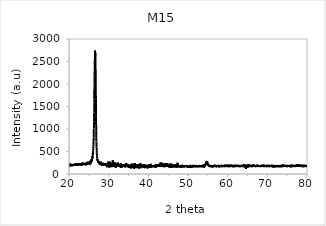
| Category | M15 |
|---|---|
| 20.0 | 202 |
| 20.02 | 184 |
| 20.04 | 186 |
| 20.06 | 164 |
| 20.08 | 152 |
| 20.1 | 196 |
| 20.12 | 188 |
| 20.14 | 162 |
| 20.16 | 178 |
| 20.18 | 228 |
| 20.2 | 204 |
| 20.22 | 192 |
| 20.24 | 180 |
| 20.26 | 234 |
| 20.28 | 190 |
| 20.3 | 220 |
| 20.32 | 182 |
| 20.34 | 214 |
| 20.36 | 182 |
| 20.38 | 204 |
| 20.4 | 214 |
| 20.42 | 176 |
| 20.44 | 214 |
| 20.46 | 188 |
| 20.48 | 200 |
| 20.5 | 204 |
| 20.52 | 204 |
| 20.54 | 216 |
| 20.56 | 192 |
| 20.58 | 194 |
| 20.6 | 198 |
| 20.62 | 216 |
| 20.64 | 204 |
| 20.66 | 198 |
| 20.68 | 170 |
| 20.7 | 186 |
| 20.72 | 194 |
| 20.74 | 202 |
| 20.76 | 208 |
| 20.78 | 198 |
| 20.8 | 204 |
| 20.82 | 196 |
| 20.84 | 196 |
| 20.86 | 200 |
| 20.88 | 194 |
| 20.9 | 178 |
| 20.92 | 214 |
| 20.94 | 188 |
| 20.96 | 220 |
| 20.98 | 196 |
| 21.0 | 202 |
| 21.02 | 190 |
| 21.04 | 212 |
| 21.06 | 184 |
| 21.08 | 188 |
| 21.1 | 178 |
| 21.12 | 208 |
| 21.14 | 198 |
| 21.16 | 216 |
| 21.18 | 196 |
| 21.2 | 192 |
| 21.22 | 180 |
| 21.24 | 200 |
| 21.26 | 210 |
| 21.28 | 204 |
| 21.3 | 218 |
| 21.32 | 200 |
| 21.34 | 210 |
| 21.36 | 208 |
| 21.38 | 218 |
| 21.4 | 176 |
| 21.42 | 214 |
| 21.44 | 206 |
| 21.46 | 176 |
| 21.48 | 216 |
| 21.5 | 230 |
| 21.52 | 182 |
| 21.54 | 214 |
| 21.56 | 196 |
| 21.58 | 180 |
| 21.6 | 204 |
| 21.62 | 190 |
| 21.64 | 194 |
| 21.66 | 230 |
| 21.68 | 204 |
| 21.7 | 202 |
| 21.72 | 212 |
| 21.74 | 242 |
| 21.76 | 224 |
| 21.78 | 206 |
| 21.8 | 202 |
| 21.82 | 218 |
| 21.84 | 210 |
| 21.86 | 230 |
| 21.88 | 182 |
| 21.9 | 232 |
| 21.92 | 226 |
| 21.94 | 208 |
| 21.96 | 240 |
| 21.98 | 196 |
| 22.0 | 190 |
| 22.02 | 200 |
| 22.04 | 210 |
| 22.06 | 208 |
| 22.08 | 216 |
| 22.1 | 234 |
| 22.12 | 224 |
| 22.14 | 220 |
| 22.16 | 206 |
| 22.18 | 224 |
| 22.2 | 210 |
| 22.22 | 220 |
| 22.24 | 218 |
| 22.26 | 212 |
| 22.28 | 224 |
| 22.3 | 230 |
| 22.32 | 184 |
| 22.34 | 220 |
| 22.36 | 220 |
| 22.38 | 236 |
| 22.4 | 222 |
| 22.42 | 202 |
| 22.44 | 206 |
| 22.46 | 200 |
| 22.48 | 218 |
| 22.5 | 208 |
| 22.52 | 212 |
| 22.54 | 208 |
| 22.56 | 206 |
| 22.58 | 208 |
| 22.6 | 210 |
| 22.62 | 214 |
| 22.64 | 214 |
| 22.66 | 228 |
| 22.68 | 218 |
| 22.7 | 210 |
| 22.72 | 234 |
| 22.74 | 206 |
| 22.76 | 210 |
| 22.78 | 216 |
| 22.8 | 216 |
| 22.82 | 204 |
| 22.84 | 226 |
| 22.86 | 228 |
| 22.88 | 202 |
| 22.9 | 212 |
| 22.92 | 208 |
| 22.94 | 190 |
| 22.96 | 202 |
| 22.98 | 230 |
| 23.0 | 226 |
| 23.02 | 212 |
| 23.04 | 218 |
| 23.06 | 224 |
| 23.08 | 228 |
| 23.1 | 216 |
| 23.12 | 208 |
| 23.14 | 212 |
| 23.16 | 222 |
| 23.18 | 206 |
| 23.2 | 240 |
| 23.22 | 224 |
| 23.24 | 228 |
| 23.26 | 224 |
| 23.28 | 206 |
| 23.3 | 188 |
| 23.32 | 230 |
| 23.34 | 204 |
| 23.36 | 206 |
| 23.38 | 216 |
| 23.4 | 202 |
| 23.42 | 218 |
| 23.44 | 250 |
| 23.46 | 208 |
| 23.48 | 248 |
| 23.5 | 212 |
| 23.52 | 206 |
| 23.54 | 234 |
| 23.56 | 228 |
| 23.58 | 210 |
| 23.6 | 220 |
| 23.62 | 230 |
| 23.64 | 230 |
| 23.66 | 224 |
| 23.68 | 220 |
| 23.7 | 226 |
| 23.72 | 204 |
| 23.74 | 222 |
| 23.76 | 222 |
| 23.78 | 220 |
| 23.8 | 218 |
| 23.82 | 234 |
| 23.84 | 232 |
| 23.86 | 214 |
| 23.88 | 216 |
| 23.9 | 220 |
| 23.92 | 218 |
| 23.94 | 216 |
| 23.96 | 222 |
| 23.98 | 216 |
| 24.0 | 214 |
| 24.02 | 208 |
| 24.04 | 196 |
| 24.06 | 222 |
| 24.08 | 220 |
| 24.1 | 240 |
| 24.12 | 240 |
| 24.14 | 238 |
| 24.16 | 242 |
| 24.18 | 196 |
| 24.2 | 226 |
| 24.22 | 232 |
| 24.24 | 214 |
| 24.26 | 222 |
| 24.28 | 220 |
| 24.3 | 230 |
| 24.32 | 218 |
| 24.34 | 216 |
| 24.36 | 220 |
| 24.38 | 230 |
| 24.4 | 222 |
| 24.42 | 242 |
| 24.44 | 218 |
| 24.46 | 238 |
| 24.48 | 256 |
| 24.5 | 230 |
| 24.52 | 220 |
| 24.54 | 240 |
| 24.56 | 244 |
| 24.58 | 242 |
| 24.6 | 272 |
| 24.62 | 232 |
| 24.64 | 230 |
| 24.66 | 242 |
| 24.68 | 208 |
| 24.7 | 232 |
| 24.72 | 242 |
| 24.74 | 228 |
| 24.76 | 234 |
| 24.78 | 266 |
| 24.8 | 240 |
| 24.82 | 230 |
| 24.84 | 226 |
| 24.86 | 250 |
| 24.88 | 246 |
| 24.9 | 236 |
| 24.92 | 230 |
| 24.94 | 246 |
| 24.96 | 232 |
| 24.98 | 266 |
| 25.0 | 244 |
| 25.02 | 242 |
| 25.04 | 254 |
| 25.06 | 252 |
| 25.08 | 230 |
| 25.1 | 244 |
| 25.12 | 244 |
| 25.14 | 238 |
| 25.16 | 270 |
| 25.18 | 244 |
| 25.2 | 198 |
| 25.22 | 208 |
| 25.24 | 268 |
| 25.26 | 278 |
| 25.28 | 246 |
| 25.3 | 240 |
| 25.32 | 232 |
| 25.34 | 248 |
| 25.36 | 246 |
| 25.38 | 238 |
| 25.4 | 228 |
| 25.42 | 266 |
| 25.44 | 294 |
| 25.46 | 242 |
| 25.48 | 288 |
| 25.5 | 298 |
| 25.52 | 296 |
| 25.54 | 270 |
| 25.56 | 258 |
| 25.58 | 258 |
| 25.6 | 292 |
| 25.62 | 306 |
| 25.64 | 322 |
| 25.66 | 280 |
| 25.68 | 298 |
| 25.7 | 298 |
| 25.72 | 296 |
| 25.74 | 280 |
| 25.76 | 328 |
| 25.78 | 304 |
| 25.8 | 334 |
| 25.82 | 326 |
| 25.84 | 334 |
| 25.86 | 360 |
| 25.88 | 394 |
| 25.9 | 362 |
| 25.92 | 350 |
| 25.94 | 370 |
| 25.96 | 384 |
| 25.98 | 422 |
| 26.0 | 436 |
| 26.02 | 460 |
| 26.04 | 466 |
| 26.06 | 436 |
| 26.08 | 530 |
| 26.1 | 568 |
| 26.12 | 600 |
| 26.14 | 606 |
| 26.16 | 660 |
| 26.18 | 694 |
| 26.2 | 728 |
| 26.22 | 810 |
| 26.24 | 890 |
| 26.26 | 1008 |
| 26.28 | 1014 |
| 26.3 | 1166 |
| 26.32 | 1248 |
| 26.34 | 1368 |
| 26.36 | 1586 |
| 26.38 | 1662 |
| 26.4 | 1890 |
| 26.42 | 1988 |
| 26.44 | 2188 |
| 26.46 | 2280 |
| 26.48 | 2402 |
| 26.5 | 2508 |
| 26.52 | 2528 |
| 26.54 | 2624 |
| 26.56 | 2710 |
| 26.58 | 2744 |
| 26.6 | 2622 |
| 26.62 | 2696 |
| 26.64 | 2642 |
| 26.66 | 2588 |
| 26.68 | 2478 |
| 26.7 | 2368 |
| 26.72 | 2304 |
| 26.74 | 2148 |
| 26.76 | 1950 |
| 26.78 | 1680 |
| 26.8 | 1466 |
| 26.82 | 1294 |
| 26.84 | 1084 |
| 26.86 | 974 |
| 26.88 | 806 |
| 26.9 | 724 |
| 26.92 | 704 |
| 26.94 | 624 |
| 26.96 | 586 |
| 26.98 | 516 |
| 27.0 | 482 |
| 27.02 | 452 |
| 27.04 | 404 |
| 27.06 | 406 |
| 27.08 | 384 |
| 27.1 | 346 |
| 27.12 | 348 |
| 27.14 | 330 |
| 27.16 | 330 |
| 27.18 | 302 |
| 27.2 | 326 |
| 27.22 | 318 |
| 27.24 | 288 |
| 27.26 | 302 |
| 27.28 | 284 |
| 27.3 | 288 |
| 27.32 | 276 |
| 27.34 | 274 |
| 27.36 | 296 |
| 27.38 | 254 |
| 27.4 | 272 |
| 27.42 | 268 |
| 27.44 | 250 |
| 27.46 | 278 |
| 27.48 | 254 |
| 27.5 | 256 |
| 27.52 | 250 |
| 27.54 | 256 |
| 27.56 | 248 |
| 27.58 | 248 |
| 27.6 | 258 |
| 27.62 | 250 |
| 27.64 | 250 |
| 27.66 | 224 |
| 27.68 | 236 |
| 27.7 | 214 |
| 27.72 | 240 |
| 27.74 | 234 |
| 27.76 | 226 |
| 27.78 | 232 |
| 27.8 | 232 |
| 27.82 | 230 |
| 27.84 | 220 |
| 27.86 | 202 |
| 27.88 | 242 |
| 27.9 | 270 |
| 27.92 | 226 |
| 27.94 | 226 |
| 27.96 | 250 |
| 27.98 | 214 |
| 28.0 | 206 |
| 28.02 | 212 |
| 28.04 | 272 |
| 28.06 | 254 |
| 28.08 | 218 |
| 28.1 | 248 |
| 28.12 | 252 |
| 28.14 | 210 |
| 28.16 | 210 |
| 28.18 | 228 |
| 28.2 | 200 |
| 28.22 | 204 |
| 28.24 | 212 |
| 28.26 | 184 |
| 28.28 | 214 |
| 28.3 | 226 |
| 28.32 | 234 |
| 28.34 | 214 |
| 28.36 | 230 |
| 28.38 | 232 |
| 28.4 | 200 |
| 28.42 | 222 |
| 28.44 | 216 |
| 28.46 | 232 |
| 28.48 | 202 |
| 28.5 | 222 |
| 28.52 | 210 |
| 28.54 | 198 |
| 28.56 | 196 |
| 28.58 | 208 |
| 28.6 | 250 |
| 28.62 | 212 |
| 28.64 | 214 |
| 28.66 | 234 |
| 28.68 | 228 |
| 28.7 | 206 |
| 28.72 | 204 |
| 28.74 | 236 |
| 28.76 | 218 |
| 28.78 | 216 |
| 28.8 | 218 |
| 28.82 | 212 |
| 28.84 | 198 |
| 28.86 | 226 |
| 28.88 | 222 |
| 28.9 | 192 |
| 28.92 | 202 |
| 28.94 | 222 |
| 28.96 | 206 |
| 28.98 | 200 |
| 29.0 | 192 |
| 29.02 | 218 |
| 29.04 | 226 |
| 29.06 | 202 |
| 29.08 | 212 |
| 29.1 | 226 |
| 29.12 | 208 |
| 29.14 | 202 |
| 29.16 | 236 |
| 29.18 | 198 |
| 29.2 | 226 |
| 29.22 | 200 |
| 29.24 | 210 |
| 29.26 | 198 |
| 29.28 | 238 |
| 29.3 | 208 |
| 29.32 | 206 |
| 29.34 | 202 |
| 29.36 | 206 |
| 29.38 | 242 |
| 29.4 | 174 |
| 29.42 | 210 |
| 29.44 | 196 |
| 29.46 | 182 |
| 29.48 | 196 |
| 29.5 | 226 |
| 29.52 | 226 |
| 29.54 | 206 |
| 29.56 | 150 |
| 29.58 | 164 |
| 29.6 | 180 |
| 29.62 | 246 |
| 29.64 | 202 |
| 29.66 | 214 |
| 29.68 | 204 |
| 29.7 | 214 |
| 29.72 | 178 |
| 29.74 | 174 |
| 29.76 | 208 |
| 29.78 | 182 |
| 29.8 | 214 |
| 29.82 | 162 |
| 29.84 | 170 |
| 29.86 | 218 |
| 29.88 | 196 |
| 29.9 | 270 |
| 29.92 | 214 |
| 29.94 | 210 |
| 29.96 | 192 |
| 29.98 | 200 |
| 30.0 | 196 |
| 30.02 | 272 |
| 30.04 | 170 |
| 30.06 | 194 |
| 30.08 | 158 |
| 30.1 | 206 |
| 30.12 | 196 |
| 30.14 | 170 |
| 30.16 | 144 |
| 30.18 | 202 |
| 30.2 | 190 |
| 30.22 | 198 |
| 30.24 | 200 |
| 30.26 | 248 |
| 30.28 | 232 |
| 30.3 | 178 |
| 30.32 | 190 |
| 30.34 | 170 |
| 30.36 | 272 |
| 30.38 | 148 |
| 30.4 | 180 |
| 30.42 | 184 |
| 30.44 | 216 |
| 30.46 | 188 |
| 30.48 | 238 |
| 30.5 | 190 |
| 30.52 | 196 |
| 30.54 | 206 |
| 30.56 | 214 |
| 30.58 | 248 |
| 30.6 | 190 |
| 30.62 | 188 |
| 30.64 | 198 |
| 30.66 | 234 |
| 30.68 | 212 |
| 30.7 | 156 |
| 30.72 | 162 |
| 30.74 | 226 |
| 30.76 | 186 |
| 30.78 | 220 |
| 30.8 | 160 |
| 30.82 | 174 |
| 30.84 | 196 |
| 30.86 | 230 |
| 30.88 | 176 |
| 30.9 | 176 |
| 30.92 | 208 |
| 30.94 | 182 |
| 30.96 | 186 |
| 30.98 | 184 |
| 31.0 | 162 |
| 31.02 | 304 |
| 31.04 | 172 |
| 31.06 | 236 |
| 31.08 | 206 |
| 31.1 | 174 |
| 31.12 | 196 |
| 31.14 | 198 |
| 31.16 | 218 |
| 31.18 | 184 |
| 31.2 | 198 |
| 31.22 | 216 |
| 31.24 | 206 |
| 31.26 | 206 |
| 31.28 | 180 |
| 31.3 | 212 |
| 31.32 | 198 |
| 31.34 | 190 |
| 31.36 | 190 |
| 31.38 | 210 |
| 31.4 | 192 |
| 31.42 | 176 |
| 31.44 | 206 |
| 31.46 | 192 |
| 31.48 | 202 |
| 31.5 | 200 |
| 31.52 | 174 |
| 31.54 | 162 |
| 31.56 | 260 |
| 31.58 | 170 |
| 31.6 | 180 |
| 31.62 | 160 |
| 31.64 | 218 |
| 31.66 | 226 |
| 31.68 | 184 |
| 31.7 | 214 |
| 31.72 | 190 |
| 31.74 | 148 |
| 31.76 | 188 |
| 31.78 | 156 |
| 31.8 | 178 |
| 31.82 | 142 |
| 31.84 | 160 |
| 31.86 | 196 |
| 31.88 | 246 |
| 31.9 | 214 |
| 31.92 | 204 |
| 31.94 | 196 |
| 31.96 | 172 |
| 31.98 | 230 |
| 32.0 | 170 |
| 32.02 | 182 |
| 32.04 | 198 |
| 32.06 | 186 |
| 32.08 | 180 |
| 32.1 | 184 |
| 32.12 | 188 |
| 32.14 | 180 |
| 32.16 | 212 |
| 32.18 | 182 |
| 32.2 | 184 |
| 32.22 | 206 |
| 32.24 | 196 |
| 32.26 | 210 |
| 32.28 | 190 |
| 32.3 | 198 |
| 32.32 | 194 |
| 32.34 | 254 |
| 32.36 | 188 |
| 32.38 | 184 |
| 32.4 | 218 |
| 32.42 | 188 |
| 32.44 | 208 |
| 32.46 | 204 |
| 32.48 | 198 |
| 32.5 | 208 |
| 32.52 | 180 |
| 32.54 | 180 |
| 32.56 | 184 |
| 32.58 | 186 |
| 32.6 | 190 |
| 32.62 | 166 |
| 32.64 | 196 |
| 32.66 | 174 |
| 32.68 | 188 |
| 32.7 | 188 |
| 32.72 | 178 |
| 32.74 | 188 |
| 32.76 | 206 |
| 32.78 | 188 |
| 32.8 | 196 |
| 32.82 | 196 |
| 32.84 | 190 |
| 32.86 | 176 |
| 32.88 | 188 |
| 32.9 | 202 |
| 32.92 | 190 |
| 32.94 | 172 |
| 32.96 | 208 |
| 32.98 | 164 |
| 33.0 | 144 |
| 33.02 | 238 |
| 33.04 | 172 |
| 33.06 | 204 |
| 33.08 | 172 |
| 33.1 | 196 |
| 33.12 | 186 |
| 33.14 | 176 |
| 33.16 | 186 |
| 33.18 | 182 |
| 33.2 | 162 |
| 33.22 | 162 |
| 33.24 | 192 |
| 33.26 | 136 |
| 33.28 | 200 |
| 33.3 | 208 |
| 33.32 | 184 |
| 33.34 | 184 |
| 33.36 | 212 |
| 33.38 | 166 |
| 33.4 | 190 |
| 33.42 | 192 |
| 33.44 | 184 |
| 33.46 | 184 |
| 33.48 | 172 |
| 33.5 | 172 |
| 33.52 | 176 |
| 33.54 | 180 |
| 33.56 | 184 |
| 33.58 | 188 |
| 33.6 | 218 |
| 33.62 | 178 |
| 33.64 | 182 |
| 33.66 | 184 |
| 33.68 | 182 |
| 33.7 | 188 |
| 33.72 | 214 |
| 33.74 | 190 |
| 33.76 | 180 |
| 33.78 | 162 |
| 33.8 | 172 |
| 33.82 | 198 |
| 33.84 | 164 |
| 33.86 | 184 |
| 33.88 | 174 |
| 33.9 | 188 |
| 33.92 | 180 |
| 33.94 | 210 |
| 33.96 | 168 |
| 33.98 | 204 |
| 34.0 | 182 |
| 34.02 | 174 |
| 34.04 | 172 |
| 34.06 | 224 |
| 34.08 | 172 |
| 34.1 | 186 |
| 34.12 | 146 |
| 34.14 | 156 |
| 34.16 | 198 |
| 34.18 | 188 |
| 34.2 | 188 |
| 34.22 | 190 |
| 34.24 | 172 |
| 34.26 | 188 |
| 34.28 | 210 |
| 34.3 | 198 |
| 34.32 | 168 |
| 34.34 | 200 |
| 34.36 | 214 |
| 34.38 | 170 |
| 34.4 | 214 |
| 34.42 | 188 |
| 34.44 | 246 |
| 34.46 | 178 |
| 34.48 | 162 |
| 34.5 | 176 |
| 34.52 | 178 |
| 34.54 | 172 |
| 34.56 | 174 |
| 34.58 | 164 |
| 34.6 | 224 |
| 34.62 | 186 |
| 34.64 | 182 |
| 34.66 | 184 |
| 34.68 | 180 |
| 34.7 | 192 |
| 34.72 | 178 |
| 34.74 | 186 |
| 34.76 | 170 |
| 34.78 | 180 |
| 34.8 | 182 |
| 34.82 | 150 |
| 34.84 | 172 |
| 34.86 | 224 |
| 34.88 | 182 |
| 34.9 | 156 |
| 34.92 | 174 |
| 34.94 | 192 |
| 34.96 | 160 |
| 34.98 | 190 |
| 35.0 | 194 |
| 35.02 | 180 |
| 35.04 | 180 |
| 35.06 | 196 |
| 35.08 | 200 |
| 35.1 | 208 |
| 35.12 | 140 |
| 35.14 | 174 |
| 35.16 | 140 |
| 35.18 | 186 |
| 35.2 | 164 |
| 35.22 | 188 |
| 35.24 | 176 |
| 35.26 | 144 |
| 35.28 | 156 |
| 35.3 | 192 |
| 35.32 | 202 |
| 35.34 | 146 |
| 35.36 | 158 |
| 35.38 | 196 |
| 35.4 | 192 |
| 35.42 | 160 |
| 35.44 | 182 |
| 35.46 | 180 |
| 35.48 | 200 |
| 35.5 | 180 |
| 35.52 | 156 |
| 35.54 | 184 |
| 35.56 | 190 |
| 35.58 | 126 |
| 35.6 | 172 |
| 35.62 | 130 |
| 35.64 | 188 |
| 35.66 | 162 |
| 35.68 | 174 |
| 35.7 | 190 |
| 35.72 | 172 |
| 35.74 | 176 |
| 35.76 | 130 |
| 35.78 | 226 |
| 35.8 | 162 |
| 35.82 | 188 |
| 35.84 | 158 |
| 35.86 | 174 |
| 35.88 | 196 |
| 35.9 | 142 |
| 35.92 | 228 |
| 35.94 | 190 |
| 35.96 | 206 |
| 35.98 | 158 |
| 36.0 | 180 |
| 36.02 | 176 |
| 36.04 | 156 |
| 36.06 | 190 |
| 36.08 | 202 |
| 36.1 | 158 |
| 36.12 | 140 |
| 36.14 | 160 |
| 36.16 | 172 |
| 36.18 | 168 |
| 36.2 | 146 |
| 36.22 | 188 |
| 36.24 | 162 |
| 36.26 | 160 |
| 36.28 | 192 |
| 36.3 | 184 |
| 36.32 | 150 |
| 36.34 | 198 |
| 36.36 | 114 |
| 36.38 | 150 |
| 36.4 | 156 |
| 36.42 | 188 |
| 36.44 | 186 |
| 36.46 | 174 |
| 36.48 | 202 |
| 36.5 | 174 |
| 36.52 | 184 |
| 36.54 | 244 |
| 36.56 | 194 |
| 36.58 | 162 |
| 36.6 | 238 |
| 36.62 | 166 |
| 36.64 | 196 |
| 36.66 | 172 |
| 36.68 | 188 |
| 36.7 | 170 |
| 36.72 | 174 |
| 36.74 | 166 |
| 36.76 | 180 |
| 36.78 | 144 |
| 36.8 | 166 |
| 36.82 | 164 |
| 36.84 | 132 |
| 36.86 | 212 |
| 36.88 | 150 |
| 36.9 | 130 |
| 36.92 | 172 |
| 36.94 | 156 |
| 36.96 | 164 |
| 36.98 | 204 |
| 37.0 | 164 |
| 37.02 | 166 |
| 37.04 | 198 |
| 37.06 | 168 |
| 37.08 | 178 |
| 37.1 | 174 |
| 37.12 | 188 |
| 37.14 | 146 |
| 37.16 | 172 |
| 37.18 | 144 |
| 37.2 | 148 |
| 37.22 | 158 |
| 37.24 | 142 |
| 37.26 | 158 |
| 37.28 | 180 |
| 37.3 | 204 |
| 37.32 | 196 |
| 37.34 | 172 |
| 37.36 | 162 |
| 37.38 | 184 |
| 37.4 | 158 |
| 37.42 | 214 |
| 37.44 | 148 |
| 37.46 | 158 |
| 37.48 | 210 |
| 37.5 | 160 |
| 37.52 | 140 |
| 37.54 | 136 |
| 37.56 | 144 |
| 37.58 | 180 |
| 37.6 | 172 |
| 37.62 | 180 |
| 37.64 | 122 |
| 37.66 | 168 |
| 37.68 | 144 |
| 37.7 | 176 |
| 37.72 | 140 |
| 37.74 | 170 |
| 37.76 | 166 |
| 37.78 | 176 |
| 37.8 | 200 |
| 37.82 | 160 |
| 37.84 | 144 |
| 37.86 | 176 |
| 37.88 | 230 |
| 37.9 | 196 |
| 37.92 | 164 |
| 37.94 | 210 |
| 37.96 | 212 |
| 37.98 | 182 |
| 38.0 | 240 |
| 38.02 | 190 |
| 38.04 | 184 |
| 38.06 | 182 |
| 38.08 | 152 |
| 38.1 | 138 |
| 38.12 | 162 |
| 38.14 | 190 |
| 38.16 | 170 |
| 38.18 | 144 |
| 38.2 | 130 |
| 38.22 | 156 |
| 38.24 | 182 |
| 38.26 | 180 |
| 38.28 | 164 |
| 38.3 | 200 |
| 38.32 | 182 |
| 38.34 | 172 |
| 38.36 | 158 |
| 38.38 | 178 |
| 38.4 | 156 |
| 38.42 | 186 |
| 38.44 | 180 |
| 38.46 | 196 |
| 38.48 | 168 |
| 38.5 | 180 |
| 38.52 | 192 |
| 38.54 | 160 |
| 38.56 | 216 |
| 38.58 | 148 |
| 38.6 | 176 |
| 38.62 | 190 |
| 38.64 | 170 |
| 38.66 | 176 |
| 38.68 | 160 |
| 38.7 | 174 |
| 38.72 | 168 |
| 38.74 | 190 |
| 38.76 | 144 |
| 38.78 | 148 |
| 38.8 | 156 |
| 38.82 | 158 |
| 38.84 | 184 |
| 38.86 | 182 |
| 38.88 | 156 |
| 38.9 | 218 |
| 38.92 | 160 |
| 38.94 | 154 |
| 38.96 | 162 |
| 38.98 | 146 |
| 39.0 | 220 |
| 39.02 | 142 |
| 39.04 | 180 |
| 39.06 | 154 |
| 39.08 | 146 |
| 39.1 | 156 |
| 39.12 | 154 |
| 39.14 | 154 |
| 39.16 | 182 |
| 39.18 | 184 |
| 39.2 | 176 |
| 39.22 | 170 |
| 39.24 | 164 |
| 39.26 | 174 |
| 39.28 | 174 |
| 39.3 | 198 |
| 39.32 | 162 |
| 39.34 | 176 |
| 39.36 | 174 |
| 39.38 | 188 |
| 39.4 | 182 |
| 39.42 | 166 |
| 39.44 | 186 |
| 39.46 | 188 |
| 39.48 | 180 |
| 39.5 | 156 |
| 39.52 | 176 |
| 39.54 | 188 |
| 39.56 | 142 |
| 39.58 | 132 |
| 39.6 | 174 |
| 39.62 | 188 |
| 39.64 | 174 |
| 39.66 | 172 |
| 39.68 | 186 |
| 39.7 | 174 |
| 39.72 | 156 |
| 39.74 | 202 |
| 39.76 | 176 |
| 39.78 | 142 |
| 39.8 | 122 |
| 39.82 | 154 |
| 39.84 | 154 |
| 39.86 | 168 |
| 39.88 | 176 |
| 39.9 | 180 |
| 39.92 | 168 |
| 39.94 | 176 |
| 39.96 | 198 |
| 39.98 | 154 |
| 40.0 | 168 |
| 40.02 | 172 |
| 40.04 | 158 |
| 40.06 | 202 |
| 40.08 | 204 |
| 40.1 | 152 |
| 40.12 | 180 |
| 40.14 | 160 |
| 40.16 | 178 |
| 40.18 | 148 |
| 40.2 | 224 |
| 40.22 | 136 |
| 40.24 | 180 |
| 40.26 | 154 |
| 40.28 | 174 |
| 40.3 | 146 |
| 40.32 | 176 |
| 40.34 | 168 |
| 40.36 | 166 |
| 40.38 | 180 |
| 40.4 | 146 |
| 40.42 | 178 |
| 40.44 | 188 |
| 40.46 | 188 |
| 40.48 | 162 |
| 40.5 | 194 |
| 40.52 | 200 |
| 40.54 | 158 |
| 40.56 | 180 |
| 40.58 | 142 |
| 40.6 | 184 |
| 40.62 | 180 |
| 40.64 | 206 |
| 40.66 | 214 |
| 40.68 | 204 |
| 40.7 | 172 |
| 40.72 | 166 |
| 40.74 | 164 |
| 40.76 | 164 |
| 40.78 | 166 |
| 40.8 | 188 |
| 40.82 | 170 |
| 40.84 | 198 |
| 40.86 | 186 |
| 40.88 | 176 |
| 40.9 | 178 |
| 40.92 | 170 |
| 40.94 | 180 |
| 40.96 | 162 |
| 40.98 | 172 |
| 41.0 | 160 |
| 41.02 | 160 |
| 41.04 | 166 |
| 41.06 | 180 |
| 41.08 | 162 |
| 41.1 | 160 |
| 41.12 | 180 |
| 41.14 | 164 |
| 41.16 | 176 |
| 41.18 | 176 |
| 41.2 | 178 |
| 41.22 | 172 |
| 41.24 | 176 |
| 41.26 | 200 |
| 41.28 | 168 |
| 41.3 | 178 |
| 41.32 | 156 |
| 41.34 | 166 |
| 41.36 | 186 |
| 41.38 | 158 |
| 41.4 | 160 |
| 41.42 | 164 |
| 41.44 | 158 |
| 41.46 | 172 |
| 41.48 | 176 |
| 41.5 | 160 |
| 41.52 | 170 |
| 41.54 | 174 |
| 41.56 | 166 |
| 41.58 | 198 |
| 41.6 | 186 |
| 41.62 | 178 |
| 41.64 | 170 |
| 41.66 | 172 |
| 41.68 | 190 |
| 41.7 | 170 |
| 41.72 | 170 |
| 41.74 | 180 |
| 41.76 | 190 |
| 41.78 | 168 |
| 41.8 | 146 |
| 41.82 | 182 |
| 41.84 | 166 |
| 41.86 | 214 |
| 41.88 | 176 |
| 41.9 | 170 |
| 41.92 | 186 |
| 41.94 | 146 |
| 41.96 | 184 |
| 41.98 | 162 |
| 42.0 | 172 |
| 42.02 | 160 |
| 42.04 | 202 |
| 42.06 | 158 |
| 42.08 | 184 |
| 42.1 | 174 |
| 42.12 | 178 |
| 42.14 | 182 |
| 42.16 | 176 |
| 42.18 | 166 |
| 42.2 | 178 |
| 42.22 | 200 |
| 42.24 | 176 |
| 42.26 | 186 |
| 42.28 | 182 |
| 42.3 | 198 |
| 42.32 | 194 |
| 42.34 | 182 |
| 42.36 | 188 |
| 42.38 | 168 |
| 42.4 | 204 |
| 42.42 | 206 |
| 42.44 | 186 |
| 42.46 | 214 |
| 42.48 | 192 |
| 42.5 | 196 |
| 42.52 | 166 |
| 42.54 | 198 |
| 42.56 | 176 |
| 42.58 | 200 |
| 42.6 | 188 |
| 42.62 | 202 |
| 42.64 | 210 |
| 42.66 | 172 |
| 42.68 | 180 |
| 42.7 | 192 |
| 42.72 | 180 |
| 42.74 | 216 |
| 42.76 | 170 |
| 42.78 | 196 |
| 42.8 | 192 |
| 42.82 | 162 |
| 42.84 | 174 |
| 42.86 | 186 |
| 42.88 | 196 |
| 42.9 | 168 |
| 42.92 | 190 |
| 42.94 | 188 |
| 42.96 | 172 |
| 42.98 | 180 |
| 43.0 | 170 |
| 43.02 | 196 |
| 43.04 | 256 |
| 43.06 | 190 |
| 43.08 | 170 |
| 43.1 | 222 |
| 43.12 | 188 |
| 43.14 | 168 |
| 43.16 | 188 |
| 43.18 | 180 |
| 43.2 | 174 |
| 43.22 | 174 |
| 43.24 | 182 |
| 43.26 | 154 |
| 43.28 | 198 |
| 43.3 | 216 |
| 43.32 | 202 |
| 43.34 | 196 |
| 43.36 | 206 |
| 43.38 | 234 |
| 43.4 | 192 |
| 43.42 | 200 |
| 43.44 | 250 |
| 43.46 | 154 |
| 43.48 | 156 |
| 43.5 | 238 |
| 43.52 | 230 |
| 43.54 | 206 |
| 43.56 | 222 |
| 43.58 | 178 |
| 43.6 | 162 |
| 43.62 | 216 |
| 43.64 | 200 |
| 43.66 | 160 |
| 43.68 | 202 |
| 43.7 | 182 |
| 43.72 | 170 |
| 43.74 | 192 |
| 43.76 | 174 |
| 43.78 | 170 |
| 43.8 | 192 |
| 43.82 | 178 |
| 43.84 | 174 |
| 43.86 | 160 |
| 43.88 | 232 |
| 43.9 | 158 |
| 43.92 | 184 |
| 43.94 | 182 |
| 43.96 | 194 |
| 43.98 | 186 |
| 44.0 | 174 |
| 44.02 | 172 |
| 44.04 | 174 |
| 44.06 | 188 |
| 44.08 | 150 |
| 44.1 | 196 |
| 44.12 | 226 |
| 44.14 | 192 |
| 44.16 | 180 |
| 44.18 | 184 |
| 44.2 | 194 |
| 44.22 | 196 |
| 44.24 | 202 |
| 44.26 | 238 |
| 44.28 | 216 |
| 44.3 | 174 |
| 44.32 | 178 |
| 44.34 | 218 |
| 44.36 | 208 |
| 44.38 | 234 |
| 44.4 | 200 |
| 44.42 | 194 |
| 44.44 | 196 |
| 44.46 | 242 |
| 44.48 | 166 |
| 44.5 | 214 |
| 44.52 | 164 |
| 44.54 | 200 |
| 44.56 | 230 |
| 44.58 | 208 |
| 44.6 | 204 |
| 44.62 | 208 |
| 44.64 | 190 |
| 44.66 | 186 |
| 44.68 | 210 |
| 44.7 | 218 |
| 44.72 | 218 |
| 44.74 | 198 |
| 44.76 | 176 |
| 44.78 | 230 |
| 44.8 | 190 |
| 44.82 | 212 |
| 44.84 | 174 |
| 44.86 | 194 |
| 44.88 | 182 |
| 44.9 | 222 |
| 44.92 | 196 |
| 44.94 | 190 |
| 44.96 | 164 |
| 44.98 | 198 |
| 45.0 | 168 |
| 45.02 | 210 |
| 45.04 | 178 |
| 45.06 | 188 |
| 45.08 | 164 |
| 45.1 | 200 |
| 45.12 | 188 |
| 45.14 | 180 |
| 45.16 | 194 |
| 45.18 | 184 |
| 45.2 | 196 |
| 45.22 | 206 |
| 45.24 | 200 |
| 45.26 | 144 |
| 45.28 | 176 |
| 45.3 | 172 |
| 45.32 | 172 |
| 45.34 | 174 |
| 45.36 | 176 |
| 45.38 | 206 |
| 45.4 | 198 |
| 45.42 | 174 |
| 45.44 | 188 |
| 45.46 | 184 |
| 45.48 | 182 |
| 45.5 | 174 |
| 45.52 | 142 |
| 45.54 | 234 |
| 45.56 | 204 |
| 45.58 | 168 |
| 45.6 | 204 |
| 45.62 | 198 |
| 45.64 | 132 |
| 45.66 | 162 |
| 45.68 | 180 |
| 45.7 | 138 |
| 45.72 | 182 |
| 45.74 | 190 |
| 45.76 | 158 |
| 45.78 | 134 |
| 45.8 | 178 |
| 45.82 | 178 |
| 45.84 | 176 |
| 45.86 | 188 |
| 45.88 | 178 |
| 45.9 | 172 |
| 45.92 | 230 |
| 45.94 | 178 |
| 45.96 | 190 |
| 45.98 | 162 |
| 46.0 | 206 |
| 46.02 | 190 |
| 46.04 | 172 |
| 46.06 | 172 |
| 46.08 | 170 |
| 46.1 | 142 |
| 46.12 | 140 |
| 46.14 | 162 |
| 46.16 | 212 |
| 46.18 | 188 |
| 46.2 | 200 |
| 46.22 | 180 |
| 46.24 | 174 |
| 46.26 | 170 |
| 46.28 | 182 |
| 46.3 | 194 |
| 46.32 | 170 |
| 46.34 | 198 |
| 46.36 | 170 |
| 46.38 | 158 |
| 46.4 | 192 |
| 46.42 | 174 |
| 46.44 | 172 |
| 46.46 | 156 |
| 46.48 | 182 |
| 46.5 | 192 |
| 46.52 | 168 |
| 46.54 | 172 |
| 46.56 | 158 |
| 46.58 | 188 |
| 46.6 | 172 |
| 46.62 | 156 |
| 46.64 | 182 |
| 46.66 | 170 |
| 46.68 | 204 |
| 46.7 | 178 |
| 46.72 | 144 |
| 46.74 | 212 |
| 46.76 | 162 |
| 46.78 | 186 |
| 46.8 | 170 |
| 46.82 | 178 |
| 46.84 | 190 |
| 46.86 | 180 |
| 46.88 | 156 |
| 46.9 | 164 |
| 46.92 | 168 |
| 46.94 | 190 |
| 46.96 | 166 |
| 46.98 | 166 |
| 47.0 | 170 |
| 47.02 | 180 |
| 47.04 | 192 |
| 47.06 | 168 |
| 47.08 | 164 |
| 47.1 | 164 |
| 47.12 | 206 |
| 47.14 | 138 |
| 47.16 | 148 |
| 47.18 | 190 |
| 47.2 | 160 |
| 47.22 | 164 |
| 47.24 | 180 |
| 47.26 | 218 |
| 47.28 | 170 |
| 47.3 | 158 |
| 47.32 | 168 |
| 47.34 | 232 |
| 47.36 | 250 |
| 47.38 | 160 |
| 47.4 | 154 |
| 47.42 | 186 |
| 47.44 | 158 |
| 47.46 | 174 |
| 47.48 | 148 |
| 47.5 | 170 |
| 47.52 | 162 |
| 47.54 | 176 |
| 47.56 | 174 |
| 47.58 | 160 |
| 47.6 | 168 |
| 47.62 | 184 |
| 47.64 | 190 |
| 47.66 | 158 |
| 47.68 | 190 |
| 47.7 | 182 |
| 47.72 | 184 |
| 47.74 | 166 |
| 47.76 | 198 |
| 47.78 | 166 |
| 47.8 | 174 |
| 47.82 | 160 |
| 47.84 | 172 |
| 47.86 | 184 |
| 47.88 | 162 |
| 47.9 | 188 |
| 47.92 | 166 |
| 47.94 | 168 |
| 47.96 | 150 |
| 47.98 | 164 |
| 48.0 | 176 |
| 48.02 | 168 |
| 48.04 | 170 |
| 48.06 | 160 |
| 48.08 | 166 |
| 48.1 | 174 |
| 48.12 | 142 |
| 48.14 | 184 |
| 48.16 | 170 |
| 48.18 | 158 |
| 48.2 | 168 |
| 48.22 | 140 |
| 48.24 | 178 |
| 48.26 | 154 |
| 48.28 | 176 |
| 48.3 | 172 |
| 48.32 | 162 |
| 48.34 | 176 |
| 48.36 | 170 |
| 48.38 | 176 |
| 48.4 | 172 |
| 48.42 | 182 |
| 48.44 | 142 |
| 48.46 | 202 |
| 48.48 | 174 |
| 48.5 | 152 |
| 48.52 | 204 |
| 48.54 | 154 |
| 48.56 | 152 |
| 48.58 | 190 |
| 48.6 | 182 |
| 48.62 | 178 |
| 48.64 | 192 |
| 48.66 | 164 |
| 48.68 | 176 |
| 48.7 | 174 |
| 48.72 | 178 |
| 48.74 | 174 |
| 48.76 | 176 |
| 48.78 | 160 |
| 48.8 | 152 |
| 48.82 | 178 |
| 48.84 | 176 |
| 48.86 | 180 |
| 48.88 | 170 |
| 48.9 | 164 |
| 48.92 | 166 |
| 48.94 | 176 |
| 48.96 | 170 |
| 48.98 | 168 |
| 49.0 | 164 |
| 49.02 | 168 |
| 49.04 | 168 |
| 49.06 | 166 |
| 49.08 | 172 |
| 49.1 | 186 |
| 49.12 | 174 |
| 49.14 | 168 |
| 49.16 | 164 |
| 49.18 | 170 |
| 49.2 | 178 |
| 49.22 | 162 |
| 49.24 | 172 |
| 49.26 | 168 |
| 49.28 | 172 |
| 49.3 | 160 |
| 49.32 | 178 |
| 49.34 | 176 |
| 49.36 | 180 |
| 49.38 | 180 |
| 49.4 | 156 |
| 49.42 | 174 |
| 49.44 | 166 |
| 49.46 | 180 |
| 49.48 | 180 |
| 49.5 | 182 |
| 49.52 | 176 |
| 49.54 | 166 |
| 49.56 | 188 |
| 49.58 | 174 |
| 49.6 | 158 |
| 49.62 | 166 |
| 49.64 | 170 |
| 49.66 | 176 |
| 49.68 | 172 |
| 49.7 | 172 |
| 49.72 | 164 |
| 49.74 | 168 |
| 49.76 | 166 |
| 49.78 | 174 |
| 49.8 | 178 |
| 49.82 | 160 |
| 49.84 | 168 |
| 49.86 | 182 |
| 49.88 | 168 |
| 49.9 | 180 |
| 49.92 | 140 |
| 49.94 | 174 |
| 49.96 | 176 |
| 49.98 | 172 |
| 50.0 | 178 |
| 50.02 | 156 |
| 50.04 | 176 |
| 50.06 | 160 |
| 50.08 | 180 |
| 50.1 | 166 |
| 50.12 | 180 |
| 50.14 | 168 |
| 50.16 | 168 |
| 50.18 | 172 |
| 50.2 | 182 |
| 50.22 | 164 |
| 50.24 | 162 |
| 50.26 | 156 |
| 50.28 | 172 |
| 50.3 | 164 |
| 50.32 | 176 |
| 50.34 | 162 |
| 50.36 | 176 |
| 50.38 | 164 |
| 50.4 | 160 |
| 50.42 | 156 |
| 50.44 | 170 |
| 50.46 | 176 |
| 50.48 | 182 |
| 50.5 | 186 |
| 50.52 | 170 |
| 50.54 | 196 |
| 50.56 | 152 |
| 50.58 | 156 |
| 50.6 | 164 |
| 50.62 | 150 |
| 50.64 | 178 |
| 50.66 | 166 |
| 50.68 | 164 |
| 50.7 | 176 |
| 50.72 | 162 |
| 50.74 | 160 |
| 50.76 | 164 |
| 50.78 | 172 |
| 50.8 | 178 |
| 50.82 | 166 |
| 50.84 | 168 |
| 50.86 | 180 |
| 50.88 | 156 |
| 50.9 | 166 |
| 50.92 | 166 |
| 50.94 | 180 |
| 50.96 | 162 |
| 50.98 | 156 |
| 51.0 | 166 |
| 51.02 | 166 |
| 51.04 | 158 |
| 51.06 | 162 |
| 51.08 | 180 |
| 51.1 | 186 |
| 51.12 | 176 |
| 51.14 | 176 |
| 51.16 | 176 |
| 51.18 | 162 |
| 51.2 | 164 |
| 51.22 | 160 |
| 51.24 | 174 |
| 51.26 | 196 |
| 51.28 | 174 |
| 51.3 | 160 |
| 51.32 | 200 |
| 51.34 | 158 |
| 51.36 | 174 |
| 51.38 | 172 |
| 51.4 | 180 |
| 51.42 | 178 |
| 51.44 | 158 |
| 51.46 | 184 |
| 51.48 | 166 |
| 51.5 | 172 |
| 51.52 | 154 |
| 51.54 | 176 |
| 51.56 | 184 |
| 51.58 | 180 |
| 51.6 | 162 |
| 51.62 | 184 |
| 51.64 | 168 |
| 51.66 | 164 |
| 51.68 | 182 |
| 51.7 | 178 |
| 51.72 | 164 |
| 51.74 | 180 |
| 51.76 | 164 |
| 51.78 | 164 |
| 51.8 | 190 |
| 51.82 | 158 |
| 51.84 | 152 |
| 51.86 | 180 |
| 51.88 | 150 |
| 51.9 | 168 |
| 51.92 | 174 |
| 51.94 | 166 |
| 51.96 | 176 |
| 51.98 | 172 |
| 52.0 | 174 |
| 52.02 | 192 |
| 52.04 | 166 |
| 52.06 | 170 |
| 52.08 | 180 |
| 52.1 | 164 |
| 52.12 | 158 |
| 52.14 | 190 |
| 52.16 | 176 |
| 52.18 | 160 |
| 52.2 | 178 |
| 52.22 | 154 |
| 52.24 | 162 |
| 52.26 | 168 |
| 52.28 | 184 |
| 52.3 | 158 |
| 52.32 | 164 |
| 52.34 | 176 |
| 52.36 | 194 |
| 52.38 | 182 |
| 52.4 | 164 |
| 52.42 | 174 |
| 52.44 | 166 |
| 52.46 | 164 |
| 52.48 | 162 |
| 52.5 | 172 |
| 52.52 | 176 |
| 52.54 | 160 |
| 52.56 | 166 |
| 52.58 | 172 |
| 52.6 | 168 |
| 52.62 | 162 |
| 52.64 | 180 |
| 52.66 | 184 |
| 52.68 | 164 |
| 52.7 | 164 |
| 52.72 | 182 |
| 52.74 | 158 |
| 52.76 | 168 |
| 52.78 | 188 |
| 52.8 | 172 |
| 52.82 | 170 |
| 52.84 | 180 |
| 52.86 | 176 |
| 52.88 | 166 |
| 52.9 | 168 |
| 52.92 | 158 |
| 52.94 | 180 |
| 52.96 | 182 |
| 52.98 | 168 |
| 53.0 | 178 |
| 53.02 | 174 |
| 53.04 | 168 |
| 53.06 | 184 |
| 53.08 | 160 |
| 53.1 | 176 |
| 53.12 | 178 |
| 53.14 | 158 |
| 53.16 | 196 |
| 53.18 | 178 |
| 53.2 | 180 |
| 53.22 | 178 |
| 53.24 | 168 |
| 53.26 | 172 |
| 53.28 | 168 |
| 53.3 | 164 |
| 53.32 | 164 |
| 53.34 | 190 |
| 53.36 | 180 |
| 53.38 | 176 |
| 53.4 | 164 |
| 53.42 | 170 |
| 53.44 | 158 |
| 53.46 | 192 |
| 53.48 | 178 |
| 53.5 | 170 |
| 53.52 | 166 |
| 53.54 | 168 |
| 53.56 | 178 |
| 53.58 | 186 |
| 53.6 | 172 |
| 53.62 | 188 |
| 53.64 | 184 |
| 53.66 | 174 |
| 53.68 | 182 |
| 53.7 | 188 |
| 53.72 | 176 |
| 53.74 | 164 |
| 53.76 | 176 |
| 53.78 | 176 |
| 53.8 | 162 |
| 53.82 | 174 |
| 53.84 | 178 |
| 53.86 | 196 |
| 53.88 | 162 |
| 53.9 | 168 |
| 53.92 | 148 |
| 53.94 | 166 |
| 53.96 | 178 |
| 53.98 | 200 |
| 54.0 | 182 |
| 54.02 | 178 |
| 54.04 | 218 |
| 54.06 | 170 |
| 54.08 | 162 |
| 54.1 | 156 |
| 54.12 | 168 |
| 54.14 | 196 |
| 54.16 | 172 |
| 54.18 | 182 |
| 54.2 | 180 |
| 54.22 | 194 |
| 54.24 | 186 |
| 54.26 | 194 |
| 54.28 | 196 |
| 54.3 | 204 |
| 54.32 | 186 |
| 54.34 | 192 |
| 54.36 | 216 |
| 54.38 | 224 |
| 54.4 | 196 |
| 54.42 | 204 |
| 54.44 | 224 |
| 54.46 | 228 |
| 54.48 | 212 |
| 54.5 | 228 |
| 54.52 | 220 |
| 54.54 | 204 |
| 54.56 | 262 |
| 54.58 | 240 |
| 54.6 | 244 |
| 54.62 | 270 |
| 54.64 | 248 |
| 54.66 | 260 |
| 54.68 | 282 |
| 54.7 | 266 |
| 54.72 | 262 |
| 54.74 | 284 |
| 54.76 | 266 |
| 54.78 | 268 |
| 54.8 | 276 |
| 54.82 | 290 |
| 54.84 | 274 |
| 54.86 | 272 |
| 54.88 | 252 |
| 54.9 | 256 |
| 54.92 | 210 |
| 54.94 | 214 |
| 54.96 | 228 |
| 54.98 | 230 |
| 55.0 | 218 |
| 55.02 | 204 |
| 55.04 | 196 |
| 55.06 | 182 |
| 55.08 | 190 |
| 55.1 | 194 |
| 55.12 | 188 |
| 55.14 | 194 |
| 55.16 | 186 |
| 55.18 | 222 |
| 55.2 | 194 |
| 55.22 | 194 |
| 55.24 | 182 |
| 55.26 | 194 |
| 55.28 | 182 |
| 55.3 | 186 |
| 55.32 | 188 |
| 55.34 | 184 |
| 55.36 | 170 |
| 55.38 | 172 |
| 55.4 | 172 |
| 55.42 | 162 |
| 55.44 | 174 |
| 55.46 | 176 |
| 55.48 | 160 |
| 55.5 | 168 |
| 55.52 | 156 |
| 55.54 | 174 |
| 55.56 | 176 |
| 55.58 | 196 |
| 55.6 | 172 |
| 55.62 | 178 |
| 55.64 | 186 |
| 55.66 | 194 |
| 55.68 | 172 |
| 55.7 | 172 |
| 55.72 | 172 |
| 55.74 | 176 |
| 55.76 | 188 |
| 55.78 | 164 |
| 55.8 | 180 |
| 55.82 | 172 |
| 55.84 | 162 |
| 55.86 | 168 |
| 55.88 | 162 |
| 55.9 | 184 |
| 55.92 | 182 |
| 55.94 | 166 |
| 55.96 | 176 |
| 55.98 | 172 |
| 56.0 | 172 |
| 56.02 | 166 |
| 56.04 | 162 |
| 56.06 | 172 |
| 56.08 | 178 |
| 56.1 | 196 |
| 56.12 | 152 |
| 56.14 | 170 |
| 56.16 | 176 |
| 56.18 | 166 |
| 56.2 | 174 |
| 56.22 | 186 |
| 56.24 | 168 |
| 56.26 | 188 |
| 56.28 | 176 |
| 56.3 | 192 |
| 56.32 | 170 |
| 56.34 | 182 |
| 56.36 | 178 |
| 56.38 | 194 |
| 56.4 | 170 |
| 56.42 | 176 |
| 56.44 | 186 |
| 56.46 | 182 |
| 56.48 | 172 |
| 56.5 | 168 |
| 56.52 | 184 |
| 56.54 | 162 |
| 56.56 | 184 |
| 56.58 | 182 |
| 56.6 | 166 |
| 56.62 | 178 |
| 56.64 | 182 |
| 56.66 | 180 |
| 56.68 | 174 |
| 56.7 | 182 |
| 56.72 | 180 |
| 56.74 | 184 |
| 56.76 | 172 |
| 56.78 | 178 |
| 56.8 | 168 |
| 56.82 | 184 |
| 56.84 | 186 |
| 56.86 | 184 |
| 56.88 | 162 |
| 56.9 | 202 |
| 56.92 | 182 |
| 56.94 | 162 |
| 56.96 | 172 |
| 56.98 | 164 |
| 57.0 | 178 |
| 57.02 | 164 |
| 57.04 | 164 |
| 57.06 | 162 |
| 57.08 | 174 |
| 57.1 | 194 |
| 57.12 | 188 |
| 57.14 | 168 |
| 57.16 | 176 |
| 57.18 | 166 |
| 57.2 | 172 |
| 57.22 | 176 |
| 57.24 | 166 |
| 57.26 | 188 |
| 57.28 | 174 |
| 57.3 | 186 |
| 57.32 | 162 |
| 57.34 | 188 |
| 57.36 | 170 |
| 57.38 | 178 |
| 57.4 | 166 |
| 57.42 | 178 |
| 57.44 | 160 |
| 57.46 | 174 |
| 57.48 | 192 |
| 57.5 | 176 |
| 57.52 | 176 |
| 57.54 | 172 |
| 57.56 | 176 |
| 57.58 | 176 |
| 57.6 | 170 |
| 57.62 | 198 |
| 57.64 | 182 |
| 57.66 | 168 |
| 57.68 | 176 |
| 57.7 | 174 |
| 57.72 | 176 |
| 57.74 | 176 |
| 57.76 | 188 |
| 57.78 | 180 |
| 57.8 | 178 |
| 57.82 | 162 |
| 57.84 | 158 |
| 57.86 | 170 |
| 57.88 | 172 |
| 57.9 | 174 |
| 57.92 | 174 |
| 57.94 | 168 |
| 57.96 | 198 |
| 57.98 | 176 |
| 58.0 | 162 |
| 58.02 | 184 |
| 58.04 | 164 |
| 58.06 | 184 |
| 58.08 | 198 |
| 58.1 | 168 |
| 58.12 | 156 |
| 58.14 | 172 |
| 58.16 | 180 |
| 58.18 | 172 |
| 58.2 | 182 |
| 58.22 | 168 |
| 58.24 | 172 |
| 58.26 | 190 |
| 58.28 | 194 |
| 58.3 | 176 |
| 58.32 | 172 |
| 58.34 | 188 |
| 58.36 | 172 |
| 58.38 | 182 |
| 58.4 | 176 |
| 58.42 | 166 |
| 58.44 | 158 |
| 58.46 | 178 |
| 58.48 | 190 |
| 58.5 | 192 |
| 58.52 | 176 |
| 58.54 | 168 |
| 58.56 | 166 |
| 58.58 | 174 |
| 58.6 | 186 |
| 58.62 | 170 |
| 58.64 | 178 |
| 58.66 | 184 |
| 58.68 | 160 |
| 58.7 | 192 |
| 58.72 | 174 |
| 58.74 | 174 |
| 58.76 | 200 |
| 58.78 | 184 |
| 58.8 | 190 |
| 58.82 | 162 |
| 58.84 | 168 |
| 58.86 | 176 |
| 58.88 | 170 |
| 58.9 | 174 |
| 58.92 | 180 |
| 58.94 | 162 |
| 58.96 | 178 |
| 58.98 | 192 |
| 59.0 | 172 |
| 59.02 | 180 |
| 59.04 | 176 |
| 59.06 | 184 |
| 59.08 | 186 |
| 59.1 | 176 |
| 59.12 | 194 |
| 59.14 | 166 |
| 59.16 | 162 |
| 59.18 | 186 |
| 59.2 | 188 |
| 59.22 | 170 |
| 59.24 | 170 |
| 59.26 | 176 |
| 59.28 | 188 |
| 59.3 | 182 |
| 59.32 | 176 |
| 59.34 | 182 |
| 59.36 | 172 |
| 59.38 | 186 |
| 59.4 | 176 |
| 59.42 | 190 |
| 59.44 | 192 |
| 59.46 | 176 |
| 59.48 | 182 |
| 59.5 | 172 |
| 59.52 | 190 |
| 59.54 | 194 |
| 59.56 | 174 |
| 59.58 | 176 |
| 59.6 | 182 |
| 59.62 | 172 |
| 59.64 | 180 |
| 59.66 | 172 |
| 59.68 | 174 |
| 59.7 | 182 |
| 59.72 | 156 |
| 59.74 | 186 |
| 59.76 | 166 |
| 59.78 | 186 |
| 59.8 | 190 |
| 59.82 | 192 |
| 59.84 | 176 |
| 59.86 | 182 |
| 59.88 | 176 |
| 59.9 | 156 |
| 59.92 | 184 |
| 59.94 | 170 |
| 59.96 | 188 |
| 59.98 | 176 |
| 60.0 | 192 |
| 60.02 | 188 |
| 60.04 | 182 |
| 60.06 | 158 |
| 60.08 | 182 |
| 60.1 | 178 |
| 60.12 | 190 |
| 60.14 | 190 |
| 60.16 | 170 |
| 60.18 | 188 |
| 60.2 | 196 |
| 60.22 | 150 |
| 60.24 | 176 |
| 60.26 | 208 |
| 60.28 | 180 |
| 60.3 | 166 |
| 60.32 | 194 |
| 60.34 | 180 |
| 60.36 | 172 |
| 60.38 | 172 |
| 60.4 | 170 |
| 60.42 | 182 |
| 60.44 | 166 |
| 60.46 | 170 |
| 60.48 | 186 |
| 60.5 | 196 |
| 60.52 | 176 |
| 60.54 | 196 |
| 60.56 | 186 |
| 60.58 | 192 |
| 60.6 | 192 |
| 60.62 | 170 |
| 60.64 | 188 |
| 60.66 | 184 |
| 60.68 | 194 |
| 60.7 | 180 |
| 60.72 | 188 |
| 60.74 | 180 |
| 60.76 | 172 |
| 60.78 | 176 |
| 60.8 | 184 |
| 60.82 | 192 |
| 60.84 | 188 |
| 60.86 | 174 |
| 60.88 | 194 |
| 60.9 | 196 |
| 60.92 | 168 |
| 60.94 | 186 |
| 60.96 | 188 |
| 60.98 | 170 |
| 61.0 | 176 |
| 61.02 | 180 |
| 61.04 | 162 |
| 61.06 | 178 |
| 61.08 | 176 |
| 61.1 | 182 |
| 61.12 | 202 |
| 61.14 | 196 |
| 61.16 | 174 |
| 61.18 | 180 |
| 61.2 | 186 |
| 61.22 | 174 |
| 61.24 | 168 |
| 61.26 | 180 |
| 61.28 | 164 |
| 61.3 | 172 |
| 61.32 | 164 |
| 61.34 | 178 |
| 61.36 | 188 |
| 61.38 | 164 |
| 61.4 | 180 |
| 61.42 | 154 |
| 61.44 | 188 |
| 61.46 | 174 |
| 61.48 | 194 |
| 61.5 | 172 |
| 61.52 | 168 |
| 61.54 | 164 |
| 61.56 | 166 |
| 61.58 | 176 |
| 61.6 | 178 |
| 61.62 | 174 |
| 61.64 | 166 |
| 61.66 | 178 |
| 61.68 | 186 |
| 61.7 | 182 |
| 61.72 | 188 |
| 61.74 | 180 |
| 61.76 | 168 |
| 61.78 | 176 |
| 61.8 | 188 |
| 61.82 | 172 |
| 61.84 | 202 |
| 61.86 | 166 |
| 61.88 | 180 |
| 61.9 | 166 |
| 61.92 | 186 |
| 61.94 | 188 |
| 61.96 | 180 |
| 61.98 | 172 |
| 62.0 | 192 |
| 62.02 | 168 |
| 62.04 | 170 |
| 62.06 | 182 |
| 62.08 | 180 |
| 62.1 | 174 |
| 62.12 | 178 |
| 62.14 | 184 |
| 62.16 | 180 |
| 62.18 | 170 |
| 62.2 | 176 |
| 62.22 | 190 |
| 62.24 | 184 |
| 62.26 | 162 |
| 62.28 | 176 |
| 62.3 | 186 |
| 62.32 | 176 |
| 62.34 | 198 |
| 62.36 | 164 |
| 62.38 | 174 |
| 62.4 | 186 |
| 62.42 | 194 |
| 62.44 | 166 |
| 62.46 | 180 |
| 62.48 | 164 |
| 62.5 | 186 |
| 62.52 | 168 |
| 62.54 | 178 |
| 62.56 | 178 |
| 62.58 | 184 |
| 62.6 | 186 |
| 62.62 | 176 |
| 62.64 | 174 |
| 62.66 | 178 |
| 62.68 | 188 |
| 62.7 | 180 |
| 62.72 | 188 |
| 62.74 | 172 |
| 62.76 | 174 |
| 62.78 | 186 |
| 62.8 | 196 |
| 62.82 | 174 |
| 62.84 | 180 |
| 62.86 | 184 |
| 62.88 | 182 |
| 62.9 | 184 |
| 62.92 | 192 |
| 62.94 | 200 |
| 62.96 | 174 |
| 62.98 | 184 |
| 63.0 | 180 |
| 63.02 | 170 |
| 63.04 | 172 |
| 63.06 | 174 |
| 63.08 | 152 |
| 63.1 | 162 |
| 63.12 | 162 |
| 63.14 | 166 |
| 63.16 | 168 |
| 63.18 | 164 |
| 63.2 | 186 |
| 63.22 | 184 |
| 63.24 | 178 |
| 63.26 | 180 |
| 63.28 | 174 |
| 63.3 | 182 |
| 63.32 | 182 |
| 63.34 | 184 |
| 63.36 | 182 |
| 63.38 | 182 |
| 63.4 | 178 |
| 63.42 | 182 |
| 63.44 | 188 |
| 63.46 | 188 |
| 63.48 | 178 |
| 63.5 | 176 |
| 63.52 | 168 |
| 63.54 | 160 |
| 63.56 | 196 |
| 63.58 | 184 |
| 63.6 | 190 |
| 63.62 | 188 |
| 63.64 | 184 |
| 63.66 | 190 |
| 63.68 | 196 |
| 63.7 | 178 |
| 63.72 | 184 |
| 63.74 | 176 |
| 63.76 | 190 |
| 63.78 | 174 |
| 63.8 | 174 |
| 63.82 | 176 |
| 63.84 | 172 |
| 63.86 | 180 |
| 63.88 | 170 |
| 63.9 | 164 |
| 63.92 | 164 |
| 63.94 | 194 |
| 63.96 | 190 |
| 63.98 | 186 |
| 64.0 | 172 |
| 64.02 | 190 |
| 64.04 | 170 |
| 64.06 | 170 |
| 64.08 | 186 |
| 64.1 | 172 |
| 64.12 | 180 |
| 64.14 | 178 |
| 64.16 | 170 |
| 64.18 | 182 |
| 64.2 | 220 |
| 64.22 | 176 |
| 64.24 | 182 |
| 64.26 | 186 |
| 64.28 | 168 |
| 64.3 | 182 |
| 64.32 | 188 |
| 64.34 | 170 |
| 64.36 | 176 |
| 64.38 | 176 |
| 64.4 | 184 |
| 64.42 | 204 |
| 64.44 | 188 |
| 64.46 | 174 |
| 64.48 | 144 |
| 64.5 | 178 |
| 64.52 | 180 |
| 64.54 | 172 |
| 64.56 | 170 |
| 64.58 | 146 |
| 64.6 | 110 |
| 64.62 | 176 |
| 64.64 | 184 |
| 64.66 | 160 |
| 64.68 | 162 |
| 64.7 | 162 |
| 64.72 | 180 |
| 64.74 | 188 |
| 64.76 | 194 |
| 64.78 | 176 |
| 64.8 | 170 |
| 64.82 | 182 |
| 64.84 | 174 |
| 64.86 | 190 |
| 64.88 | 186 |
| 64.9 | 170 |
| 64.92 | 152 |
| 64.94 | 170 |
| 64.96 | 206 |
| 64.98 | 170 |
| 65.0 | 146 |
| 65.02 | 174 |
| 65.04 | 178 |
| 65.06 | 174 |
| 65.08 | 152 |
| 65.1 | 200 |
| 65.12 | 212 |
| 65.14 | 184 |
| 65.16 | 174 |
| 65.18 | 186 |
| 65.2 | 178 |
| 65.22 | 198 |
| 65.24 | 186 |
| 65.26 | 178 |
| 65.28 | 174 |
| 65.3 | 168 |
| 65.32 | 174 |
| 65.34 | 176 |
| 65.36 | 178 |
| 65.38 | 194 |
| 65.4 | 202 |
| 65.42 | 196 |
| 65.44 | 182 |
| 65.46 | 180 |
| 65.48 | 184 |
| 65.5 | 164 |
| 65.52 | 180 |
| 65.54 | 168 |
| 65.56 | 186 |
| 65.58 | 180 |
| 65.6 | 168 |
| 65.62 | 186 |
| 65.64 | 176 |
| 65.66 | 176 |
| 65.68 | 188 |
| 65.7 | 162 |
| 65.72 | 158 |
| 65.74 | 186 |
| 65.76 | 192 |
| 65.78 | 164 |
| 65.8 | 178 |
| 65.82 | 188 |
| 65.84 | 182 |
| 65.86 | 170 |
| 65.88 | 176 |
| 65.9 | 182 |
| 65.92 | 162 |
| 65.94 | 184 |
| 65.96 | 188 |
| 65.98 | 184 |
| 66.0 | 168 |
| 66.02 | 184 |
| 66.04 | 164 |
| 66.06 | 176 |
| 66.08 | 184 |
| 66.1 | 170 |
| 66.12 | 182 |
| 66.14 | 178 |
| 66.16 | 174 |
| 66.18 | 168 |
| 66.2 | 178 |
| 66.22 | 170 |
| 66.24 | 160 |
| 66.26 | 180 |
| 66.28 | 176 |
| 66.3 | 176 |
| 66.32 | 166 |
| 66.34 | 156 |
| 66.36 | 206 |
| 66.38 | 182 |
| 66.4 | 182 |
| 66.42 | 194 |
| 66.44 | 178 |
| 66.46 | 178 |
| 66.48 | 182 |
| 66.5 | 188 |
| 66.52 | 204 |
| 66.54 | 166 |
| 66.56 | 178 |
| 66.58 | 172 |
| 66.6 | 170 |
| 66.62 | 190 |
| 66.64 | 196 |
| 66.66 | 184 |
| 66.68 | 182 |
| 66.7 | 196 |
| 66.72 | 164 |
| 66.74 | 182 |
| 66.76 | 166 |
| 66.78 | 194 |
| 66.8 | 194 |
| 66.82 | 184 |
| 66.84 | 186 |
| 66.86 | 170 |
| 66.88 | 194 |
| 66.9 | 176 |
| 66.92 | 180 |
| 66.94 | 164 |
| 66.96 | 176 |
| 66.98 | 182 |
| 67.0 | 164 |
| 67.02 | 166 |
| 67.04 | 154 |
| 67.06 | 182 |
| 67.08 | 160 |
| 67.1 | 182 |
| 67.12 | 158 |
| 67.14 | 174 |
| 67.16 | 182 |
| 67.18 | 176 |
| 67.2 | 178 |
| 67.22 | 176 |
| 67.24 | 180 |
| 67.26 | 166 |
| 67.28 | 174 |
| 67.3 | 192 |
| 67.32 | 180 |
| 67.34 | 194 |
| 67.36 | 190 |
| 67.38 | 192 |
| 67.4 | 166 |
| 67.42 | 194 |
| 67.44 | 176 |
| 67.46 | 170 |
| 67.48 | 170 |
| 67.5 | 176 |
| 67.52 | 192 |
| 67.54 | 170 |
| 67.56 | 188 |
| 67.58 | 204 |
| 67.6 | 176 |
| 67.62 | 186 |
| 67.64 | 164 |
| 67.66 | 172 |
| 67.68 | 182 |
| 67.7 | 180 |
| 67.72 | 174 |
| 67.74 | 180 |
| 67.76 | 166 |
| 67.78 | 190 |
| 67.8 | 170 |
| 67.82 | 164 |
| 67.84 | 160 |
| 67.86 | 192 |
| 67.88 | 188 |
| 67.9 | 180 |
| 67.92 | 190 |
| 67.94 | 170 |
| 67.96 | 160 |
| 67.98 | 190 |
| 68.0 | 178 |
| 68.02 | 170 |
| 68.04 | 160 |
| 68.06 | 182 |
| 68.08 | 186 |
| 68.1 | 192 |
| 68.12 | 176 |
| 68.14 | 184 |
| 68.16 | 170 |
| 68.18 | 182 |
| 68.2 | 172 |
| 68.22 | 180 |
| 68.24 | 184 |
| 68.26 | 178 |
| 68.28 | 176 |
| 68.3 | 168 |
| 68.32 | 174 |
| 68.34 | 154 |
| 68.36 | 182 |
| 68.38 | 186 |
| 68.4 | 178 |
| 68.42 | 168 |
| 68.44 | 180 |
| 68.46 | 192 |
| 68.48 | 164 |
| 68.5 | 178 |
| 68.52 | 196 |
| 68.54 | 172 |
| 68.56 | 186 |
| 68.58 | 180 |
| 68.6 | 166 |
| 68.62 | 180 |
| 68.64 | 166 |
| 68.66 | 174 |
| 68.68 | 180 |
| 68.7 | 192 |
| 68.72 | 192 |
| 68.74 | 174 |
| 68.76 | 186 |
| 68.78 | 180 |
| 68.8 | 170 |
| 68.82 | 184 |
| 68.84 | 170 |
| 68.86 | 182 |
| 68.88 | 162 |
| 68.9 | 166 |
| 68.92 | 174 |
| 68.94 | 186 |
| 68.96 | 164 |
| 68.98 | 174 |
| 69.0 | 168 |
| 69.02 | 184 |
| 69.04 | 186 |
| 69.06 | 188 |
| 69.08 | 192 |
| 69.1 | 196 |
| 69.12 | 186 |
| 69.14 | 186 |
| 69.16 | 168 |
| 69.18 | 170 |
| 69.2 | 166 |
| 69.22 | 174 |
| 69.24 | 168 |
| 69.26 | 186 |
| 69.28 | 176 |
| 69.3 | 188 |
| 69.32 | 186 |
| 69.34 | 166 |
| 69.36 | 176 |
| 69.38 | 180 |
| 69.4 | 190 |
| 69.42 | 186 |
| 69.44 | 182 |
| 69.46 | 182 |
| 69.48 | 184 |
| 69.5 | 158 |
| 69.52 | 196 |
| 69.54 | 192 |
| 69.56 | 186 |
| 69.58 | 182 |
| 69.6 | 180 |
| 69.62 | 190 |
| 69.64 | 178 |
| 69.66 | 170 |
| 69.68 | 188 |
| 69.7 | 170 |
| 69.72 | 174 |
| 69.74 | 164 |
| 69.76 | 194 |
| 69.78 | 172 |
| 69.8 | 170 |
| 69.82 | 184 |
| 69.84 | 176 |
| 69.86 | 168 |
| 69.88 | 172 |
| 69.9 | 172 |
| 69.92 | 178 |
| 69.94 | 190 |
| 69.96 | 188 |
| 69.98 | 182 |
| 70.0 | 176 |
| 70.02 | 180 |
| 70.04 | 178 |
| 70.06 | 182 |
| 70.08 | 164 |
| 70.1 | 176 |
| 70.12 | 162 |
| 70.14 | 176 |
| 70.16 | 178 |
| 70.18 | 180 |
| 70.2 | 198 |
| 70.22 | 174 |
| 70.24 | 180 |
| 70.26 | 190 |
| 70.28 | 172 |
| 70.3 | 162 |
| 70.32 | 194 |
| 70.34 | 180 |
| 70.36 | 204 |
| 70.38 | 194 |
| 70.4 | 162 |
| 70.42 | 188 |
| 70.44 | 186 |
| 70.46 | 194 |
| 70.48 | 162 |
| 70.5 | 180 |
| 70.52 | 178 |
| 70.54 | 170 |
| 70.56 | 166 |
| 70.58 | 180 |
| 70.6 | 170 |
| 70.62 | 182 |
| 70.64 | 176 |
| 70.66 | 188 |
| 70.68 | 192 |
| 70.7 | 164 |
| 70.72 | 178 |
| 70.74 | 180 |
| 70.76 | 162 |
| 70.78 | 184 |
| 70.8 | 176 |
| 70.82 | 184 |
| 70.84 | 154 |
| 70.86 | 176 |
| 70.88 | 174 |
| 70.9 | 182 |
| 70.92 | 156 |
| 70.94 | 176 |
| 70.96 | 180 |
| 70.98 | 180 |
| 71.0 | 184 |
| 71.02 | 190 |
| 71.04 | 184 |
| 71.06 | 196 |
| 71.08 | 184 |
| 71.1 | 184 |
| 71.12 | 192 |
| 71.14 | 166 |
| 71.16 | 178 |
| 71.18 | 190 |
| 71.2 | 182 |
| 71.22 | 174 |
| 71.24 | 190 |
| 71.26 | 166 |
| 71.28 | 162 |
| 71.3 | 170 |
| 71.32 | 184 |
| 71.34 | 166 |
| 71.36 | 184 |
| 71.38 | 170 |
| 71.4 | 202 |
| 71.42 | 176 |
| 71.44 | 172 |
| 71.46 | 158 |
| 71.48 | 174 |
| 71.5 | 182 |
| 71.52 | 180 |
| 71.54 | 178 |
| 71.56 | 164 |
| 71.58 | 190 |
| 71.6 | 168 |
| 71.62 | 162 |
| 71.64 | 170 |
| 71.66 | 168 |
| 71.68 | 168 |
| 71.7 | 168 |
| 71.72 | 170 |
| 71.74 | 200 |
| 71.76 | 198 |
| 71.78 | 186 |
| 71.8 | 174 |
| 71.82 | 192 |
| 71.84 | 146 |
| 71.86 | 180 |
| 71.88 | 176 |
| 71.9 | 186 |
| 71.92 | 168 |
| 71.94 | 174 |
| 71.96 | 176 |
| 71.98 | 170 |
| 72.0 | 176 |
| 72.02 | 172 |
| 72.04 | 160 |
| 72.06 | 202 |
| 72.08 | 172 |
| 72.1 | 172 |
| 72.12 | 196 |
| 72.14 | 190 |
| 72.16 | 166 |
| 72.18 | 168 |
| 72.2 | 168 |
| 72.22 | 172 |
| 72.24 | 194 |
| 72.26 | 180 |
| 72.28 | 188 |
| 72.3 | 194 |
| 72.32 | 174 |
| 72.34 | 188 |
| 72.36 | 170 |
| 72.38 | 172 |
| 72.4 | 178 |
| 72.42 | 188 |
| 72.44 | 198 |
| 72.46 | 172 |
| 72.48 | 180 |
| 72.5 | 176 |
| 72.52 | 172 |
| 72.54 | 180 |
| 72.56 | 160 |
| 72.58 | 172 |
| 72.6 | 182 |
| 72.62 | 164 |
| 72.64 | 168 |
| 72.66 | 166 |
| 72.68 | 182 |
| 72.7 | 168 |
| 72.72 | 170 |
| 72.74 | 188 |
| 72.76 | 168 |
| 72.78 | 162 |
| 72.8 | 192 |
| 72.82 | 184 |
| 72.84 | 196 |
| 72.86 | 166 |
| 72.88 | 176 |
| 72.9 | 184 |
| 72.92 | 184 |
| 72.94 | 172 |
| 72.96 | 162 |
| 72.98 | 186 |
| 73.0 | 170 |
| 73.02 | 178 |
| 73.04 | 158 |
| 73.06 | 174 |
| 73.08 | 150 |
| 73.1 | 186 |
| 73.12 | 172 |
| 73.14 | 184 |
| 73.16 | 176 |
| 73.18 | 176 |
| 73.2 | 174 |
| 73.22 | 176 |
| 73.24 | 180 |
| 73.26 | 178 |
| 73.28 | 176 |
| 73.3 | 170 |
| 73.32 | 154 |
| 73.34 | 184 |
| 73.36 | 174 |
| 73.38 | 186 |
| 73.4 | 186 |
| 73.42 | 166 |
| 73.44 | 188 |
| 73.46 | 172 |
| 73.48 | 166 |
| 73.5 | 170 |
| 73.52 | 176 |
| 73.54 | 160 |
| 73.56 | 192 |
| 73.58 | 176 |
| 73.6 | 160 |
| 73.62 | 174 |
| 73.64 | 170 |
| 73.66 | 194 |
| 73.68 | 168 |
| 73.7 | 182 |
| 73.72 | 178 |
| 73.74 | 170 |
| 73.76 | 184 |
| 73.78 | 176 |
| 73.8 | 164 |
| 73.82 | 172 |
| 73.84 | 172 |
| 73.86 | 166 |
| 73.88 | 214 |
| 73.9 | 176 |
| 73.92 | 186 |
| 73.94 | 180 |
| 73.96 | 186 |
| 73.98 | 194 |
| 74.0 | 194 |
| 74.02 | 172 |
| 74.04 | 182 |
| 74.06 | 188 |
| 74.08 | 180 |
| 74.1 | 166 |
| 74.12 | 184 |
| 74.14 | 188 |
| 74.16 | 192 |
| 74.18 | 164 |
| 74.2 | 166 |
| 74.22 | 164 |
| 74.24 | 196 |
| 74.26 | 192 |
| 74.28 | 170 |
| 74.3 | 176 |
| 74.32 | 190 |
| 74.34 | 182 |
| 74.36 | 166 |
| 74.38 | 172 |
| 74.4 | 180 |
| 74.42 | 176 |
| 74.44 | 190 |
| 74.46 | 184 |
| 74.48 | 180 |
| 74.5 | 190 |
| 74.52 | 182 |
| 74.54 | 184 |
| 74.56 | 184 |
| 74.58 | 168 |
| 74.6 | 174 |
| 74.62 | 178 |
| 74.64 | 184 |
| 74.66 | 170 |
| 74.68 | 168 |
| 74.7 | 194 |
| 74.72 | 174 |
| 74.74 | 186 |
| 74.76 | 182 |
| 74.78 | 158 |
| 74.8 | 176 |
| 74.82 | 182 |
| 74.84 | 174 |
| 74.86 | 164 |
| 74.88 | 170 |
| 74.9 | 182 |
| 74.92 | 184 |
| 74.94 | 184 |
| 74.96 | 186 |
| 74.98 | 192 |
| 75.0 | 194 |
| 75.02 | 168 |
| 75.04 | 178 |
| 75.06 | 176 |
| 75.08 | 184 |
| 75.1 | 182 |
| 75.12 | 176 |
| 75.14 | 184 |
| 75.16 | 186 |
| 75.18 | 184 |
| 75.2 | 176 |
| 75.22 | 172 |
| 75.24 | 170 |
| 75.26 | 192 |
| 75.28 | 186 |
| 75.3 | 170 |
| 75.32 | 178 |
| 75.34 | 164 |
| 75.36 | 176 |
| 75.38 | 178 |
| 75.4 | 156 |
| 75.42 | 192 |
| 75.44 | 178 |
| 75.46 | 170 |
| 75.48 | 178 |
| 75.5 | 190 |
| 75.52 | 172 |
| 75.54 | 194 |
| 75.56 | 174 |
| 75.58 | 194 |
| 75.6 | 164 |
| 75.62 | 200 |
| 75.64 | 184 |
| 75.66 | 186 |
| 75.68 | 188 |
| 75.7 | 186 |
| 75.72 | 172 |
| 75.74 | 182 |
| 75.76 | 192 |
| 75.78 | 174 |
| 75.8 | 170 |
| 75.82 | 168 |
| 75.84 | 174 |
| 75.86 | 180 |
| 75.88 | 182 |
| 75.9 | 180 |
| 75.92 | 196 |
| 75.94 | 168 |
| 75.96 | 168 |
| 75.98 | 176 |
| 76.0 | 182 |
| 76.02 | 194 |
| 76.04 | 170 |
| 76.06 | 148 |
| 76.08 | 170 |
| 76.1 | 176 |
| 76.12 | 180 |
| 76.14 | 162 |
| 76.16 | 174 |
| 76.18 | 196 |
| 76.2 | 172 |
| 76.22 | 166 |
| 76.24 | 210 |
| 76.26 | 166 |
| 76.28 | 176 |
| 76.3 | 186 |
| 76.32 | 170 |
| 76.34 | 192 |
| 76.36 | 172 |
| 76.38 | 172 |
| 76.4 | 184 |
| 76.42 | 174 |
| 76.44 | 182 |
| 76.46 | 170 |
| 76.48 | 182 |
| 76.5 | 154 |
| 76.52 | 178 |
| 76.54 | 196 |
| 76.56 | 186 |
| 76.58 | 178 |
| 76.6 | 186 |
| 76.62 | 192 |
| 76.64 | 190 |
| 76.66 | 188 |
| 76.68 | 198 |
| 76.7 | 178 |
| 76.72 | 182 |
| 76.74 | 182 |
| 76.76 | 168 |
| 76.78 | 186 |
| 76.8 | 184 |
| 76.82 | 186 |
| 76.84 | 184 |
| 76.86 | 186 |
| 76.88 | 180 |
| 76.9 | 184 |
| 76.92 | 174 |
| 76.94 | 180 |
| 76.96 | 194 |
| 76.98 | 170 |
| 77.0 | 178 |
| 77.02 | 178 |
| 77.04 | 186 |
| 77.06 | 186 |
| 77.08 | 190 |
| 77.1 | 176 |
| 77.12 | 190 |
| 77.14 | 186 |
| 77.16 | 174 |
| 77.18 | 182 |
| 77.2 | 174 |
| 77.22 | 180 |
| 77.24 | 190 |
| 77.26 | 172 |
| 77.28 | 180 |
| 77.3 | 176 |
| 77.32 | 184 |
| 77.34 | 196 |
| 77.36 | 178 |
| 77.38 | 168 |
| 77.4 | 202 |
| 77.42 | 190 |
| 77.44 | 174 |
| 77.46 | 212 |
| 77.48 | 196 |
| 77.5 | 184 |
| 77.52 | 200 |
| 77.54 | 184 |
| 77.56 | 206 |
| 77.58 | 176 |
| 77.6 | 198 |
| 77.62 | 198 |
| 77.64 | 220 |
| 77.66 | 188 |
| 77.68 | 198 |
| 77.7 | 188 |
| 77.72 | 186 |
| 77.74 | 176 |
| 77.76 | 180 |
| 77.78 | 188 |
| 77.8 | 204 |
| 77.82 | 194 |
| 77.84 | 180 |
| 77.86 | 192 |
| 77.88 | 194 |
| 77.9 | 192 |
| 77.92 | 182 |
| 77.94 | 190 |
| 77.96 | 172 |
| 77.98 | 184 |
| 78.0 | 188 |
| 78.02 | 184 |
| 78.04 | 182 |
| 78.06 | 188 |
| 78.08 | 178 |
| 78.1 | 192 |
| 78.12 | 184 |
| 78.14 | 186 |
| 78.16 | 192 |
| 78.18 | 188 |
| 78.2 | 184 |
| 78.22 | 188 |
| 78.24 | 186 |
| 78.26 | 178 |
| 78.28 | 180 |
| 78.3 | 182 |
| 78.32 | 178 |
| 78.34 | 178 |
| 78.36 | 174 |
| 78.38 | 180 |
| 78.4 | 178 |
| 78.42 | 186 |
| 78.44 | 186 |
| 78.46 | 166 |
| 78.48 | 178 |
| 78.5 | 198 |
| 78.52 | 176 |
| 78.54 | 174 |
| 78.56 | 194 |
| 78.58 | 204 |
| 78.6 | 186 |
| 78.62 | 178 |
| 78.64 | 180 |
| 78.66 | 184 |
| 78.68 | 188 |
| 78.7 | 184 |
| 78.72 | 178 |
| 78.74 | 172 |
| 78.76 | 182 |
| 78.78 | 166 |
| 78.8 | 170 |
| 78.82 | 180 |
| 78.84 | 172 |
| 78.86 | 170 |
| 78.88 | 186 |
| 78.9 | 174 |
| 78.92 | 182 |
| 78.94 | 186 |
| 78.96 | 172 |
| 78.98 | 190 |
| 79.0 | 182 |
| 79.02 | 166 |
| 79.04 | 178 |
| 79.06 | 186 |
| 79.08 | 180 |
| 79.1 | 186 |
| 79.12 | 180 |
| 79.14 | 182 |
| 79.16 | 168 |
| 79.18 | 166 |
| 79.2 | 174 |
| 79.22 | 182 |
| 79.24 | 194 |
| 79.26 | 180 |
| 79.28 | 198 |
| 79.3 | 182 |
| 79.32 | 206 |
| 79.34 | 190 |
| 79.36 | 202 |
| 79.38 | 176 |
| 79.4 | 178 |
| 79.42 | 188 |
| 79.44 | 164 |
| 79.46 | 182 |
| 79.48 | 182 |
| 79.5 | 182 |
| 79.52 | 178 |
| 79.54 | 170 |
| 79.56 | 190 |
| 79.58 | 174 |
| 79.6 | 186 |
| 79.62 | 172 |
| 79.64 | 186 |
| 79.66 | 178 |
| 79.68 | 176 |
| 79.7 | 172 |
| 79.72 | 172 |
| 79.74 | 172 |
| 79.76 | 184 |
| 79.78 | 184 |
| 79.8 | 172 |
| 79.82 | 174 |
| 79.84 | 176 |
| 79.86 | 184 |
| 79.88 | 184 |
| 79.9 | 174 |
| 79.92 | 182 |
| 79.94 | 184 |
| 79.96 | 172 |
| 79.98 | 178 |